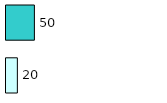
| Category | Series 0 | Series 1 |
|---|---|---|
| 0 | 20 | 50 |